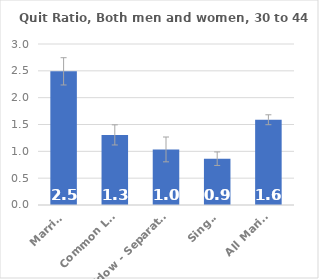
| Category | Quit Ratio |
|---|---|
| Married | 2.491 |
| Common Law | 1.306 |
| Widow - Separated - Divorced | 1.036 |
| Single | 0.863 |
| All Marital | 1.589 |